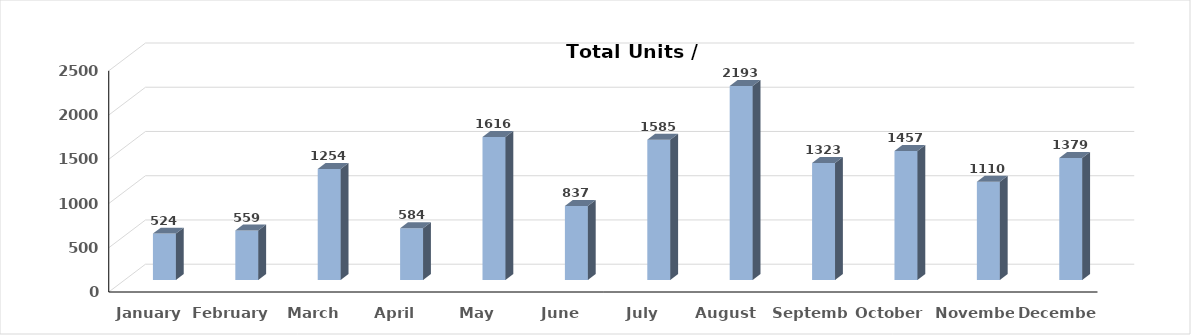
| Category | UNIT |
|---|---|
| January | 524 |
| February | 559 |
| March | 1254 |
| April | 584 |
| May | 1616 |
| June | 837 |
| July | 1585 |
| August | 2193 |
| September | 1323 |
| October | 1457 |
| November | 1110 |
| December | 1379 |